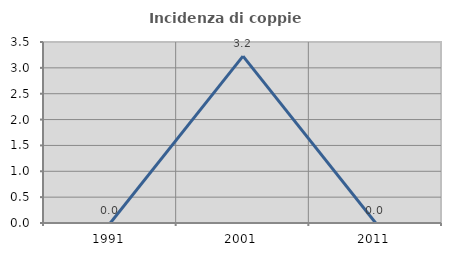
| Category | Incidenza di coppie miste |
|---|---|
| 1991.0 | 0 |
| 2001.0 | 3.226 |
| 2011.0 | 0 |